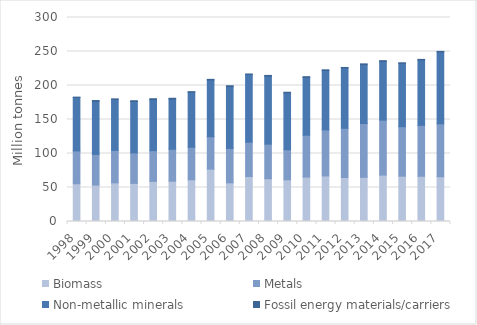
| Category | Biomass | Metals | Non-metallic minerals | Fossil energy materials/carriers |
|---|---|---|---|---|
| 1998.0 | 55.507 | 48.234 | 78.756 | 0.319 |
| 1999.0 | 53.56 | 45.113 | 77.989 | 1.234 |
| 2000.0 | 56.799 | 47.732 | 75.055 | 0.712 |
| 2001.0 | 56.024 | 44.862 | 75.561 | 1.169 |
| 2002.0 | 58.966 | 45.156 | 75.047 | 1.406 |
| 2003.0 | 59.375 | 46.889 | 73.732 | 1.243 |
| 2004.0 | 61.355 | 47.83 | 80.845 | 0.894 |
| 2005.0 | 76.978 | 47.687 | 83.378 | 1 |
| 2006.0 | 56.887 | 50.691 | 90.646 | 1.427 |
| 2007.0 | 66.138 | 50.466 | 99.471 | 0.878 |
| 2008.0 | 62.923 | 50.844 | 99.977 | 1.071 |
| 2009.0 | 61.314 | 44.222 | 83.551 | 1.002 |
| 2010.0 | 65.34 | 61.516 | 85.067 | 1.039 |
| 2011.0 | 66.991 | 67.717 | 87.229 | 1.125 |
| 2012.0 | 64.711 | 72.374 | 88.61 | 0.847 |
| 2013.0 | 64.959 | 79.086 | 86.528 | 1.255 |
| 2014.0 | 68.225 | 80.836 | 86.326 | 1.112 |
| 2015.0 | 66.658 | 72.694 | 93.26 | 0.718 |
| 2016.0 | 66.511 | 74.864 | 96.106 | 0.925 |
| 2017.0 | 65.866 | 77.785 | 105.67 | 0.825 |